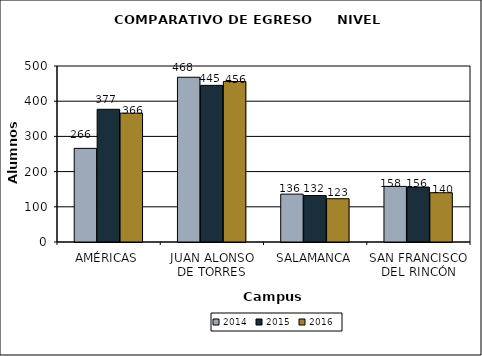
| Category | 2014 | 2015 | 2016 |
|---|---|---|---|
| AMÉRICAS | 266 | 377 | 366 |
| JUAN ALONSO DE TORRES | 468 | 445 | 456 |
| SALAMANCA | 136 | 132 | 123 |
| SAN FRANCISCO DEL RINCÓN | 158 | 156 | 140 |